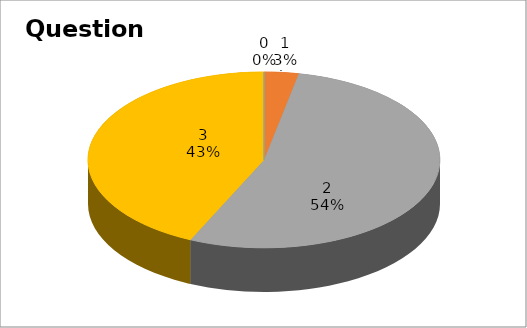
| Category | Series 0 |
|---|---|
| 0 | 0 |
| 1 | 3 |
| 2 | 51 |
| 3 | 41 |